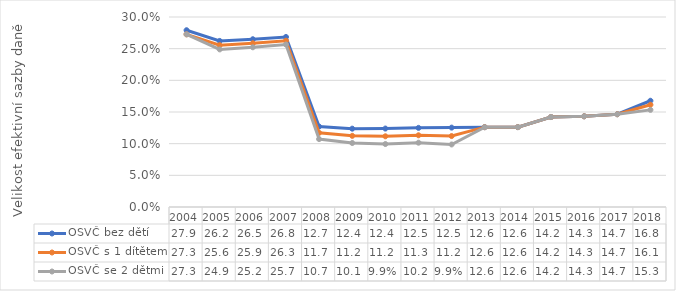
| Category | OSVČ bez dětí | OSVČ s 1 dítětem | OSVČ se 2 dětmi |
|---|---|---|---|
| 2004.0 | 0.279 | 0.273 | 0.273 |
| 2005.0 | 0.262 | 0.256 | 0.249 |
| 2006.0 | 0.265 | 0.259 | 0.252 |
| 2007.0 | 0.268 | 0.263 | 0.257 |
| 2008.0 | 0.127 | 0.117 | 0.107 |
| 2009.0 | 0.124 | 0.112 | 0.101 |
| 2010.0 | 0.124 | 0.112 | 0.099 |
| 2011.0 | 0.125 | 0.113 | 0.102 |
| 2012.0 | 0.125 | 0.112 | 0.099 |
| 2013.0 | 0.126 | 0.126 | 0.126 |
| 2014.0 | 0.126 | 0.126 | 0.126 |
| 2015.0 | 0.142 | 0.142 | 0.142 |
| 2016.0 | 0.143 | 0.143 | 0.143 |
| 2017.0 | 0.147 | 0.147 | 0.147 |
| 2018.0 | 0.168 | 0.161 | 0.153 |